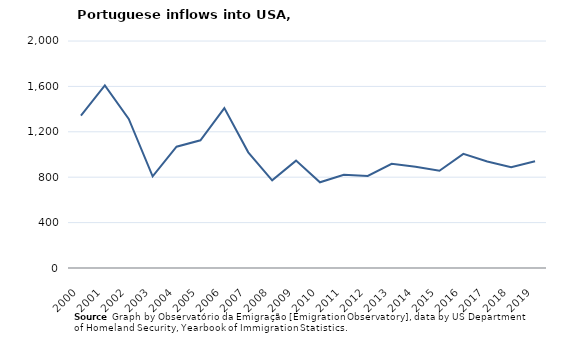
| Category | Entradas de portugueses |
|---|---|
| 2000.0 | 1343 |
| 2001.0 | 1609 |
| 2002.0 | 1313 |
| 2003.0 | 808 |
| 2004.0 | 1069 |
| 2005.0 | 1125 |
| 2006.0 | 1409 |
| 2007.0 | 1019 |
| 2008.0 | 772 |
| 2009.0 | 946 |
| 2010.0 | 755 |
| 2011.0 | 821 |
| 2012.0 | 811 |
| 2013.0 | 918 |
| 2014.0 | 892 |
| 2015.0 | 857 |
| 2016.0 | 1006 |
| 2017.0 | 939 |
| 2018.0 | 889 |
| 2019.0 | 940 |